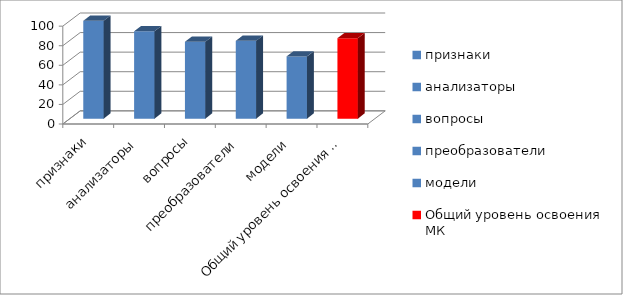
| Category | Series 0 |
|---|---|
| признаки | 100 |
| анализаторы | 89.286 |
| вопросы | 78.571 |
| преобразователи | 79.545 |
| модели | 63.611 |
| Общий уровень освоения МК | 82.203 |